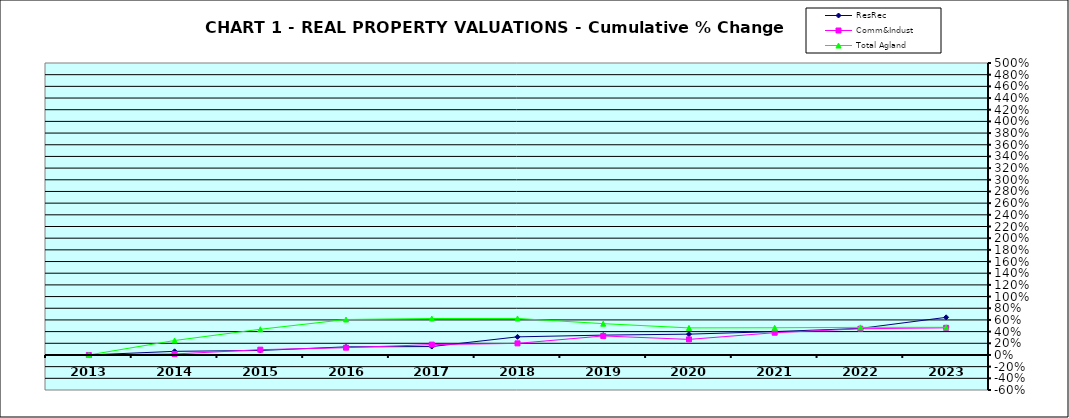
| Category | ResRec | Comm&Indust | Total Agland |
|---|---|---|---|
| 2013.0 | 0 | 0 | 0 |
| 2014.0 | 0.062 | 0.017 | 0.248 |
| 2015.0 | 0.077 | 0.091 | 0.44 |
| 2016.0 | 0.139 | 0.125 | 0.607 |
| 2017.0 | 0.144 | 0.177 | 0.624 |
| 2018.0 | 0.31 | 0.199 | 0.625 |
| 2019.0 | 0.34 | 0.326 | 0.536 |
| 2020.0 | 0.357 | 0.267 | 0.464 |
| 2021.0 | 0.4 | 0.381 | 0.466 |
| 2022.0 | 0.454 | 0.449 | 0.473 |
| 2023.0 | 0.644 | 0.465 | 0.473 |